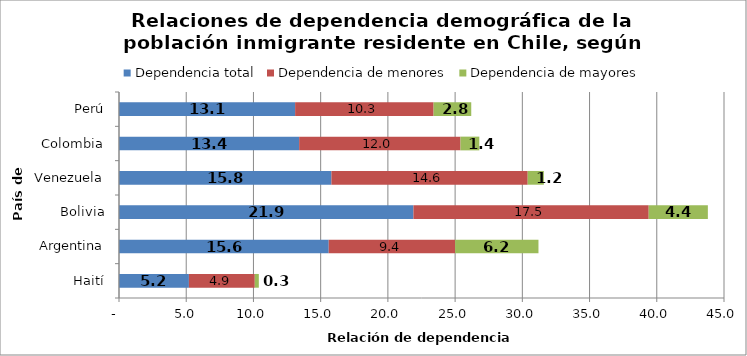
| Category | Dependencia total | Dependencia de menores | Dependencia de mayores |
|---|---|---|---|
| Haití | 5.2 | 4.9 | 0.3 |
| Argentina | 15.6 | 9.4 | 6.2 |
| Bolivia | 21.9 | 17.5 | 4.4 |
| Venezuela | 15.8 | 14.6 | 1.2 |
| Colombia | 13.4 | 12 | 1.4 |
| Perú | 13.1 | 10.3 | 2.8 |